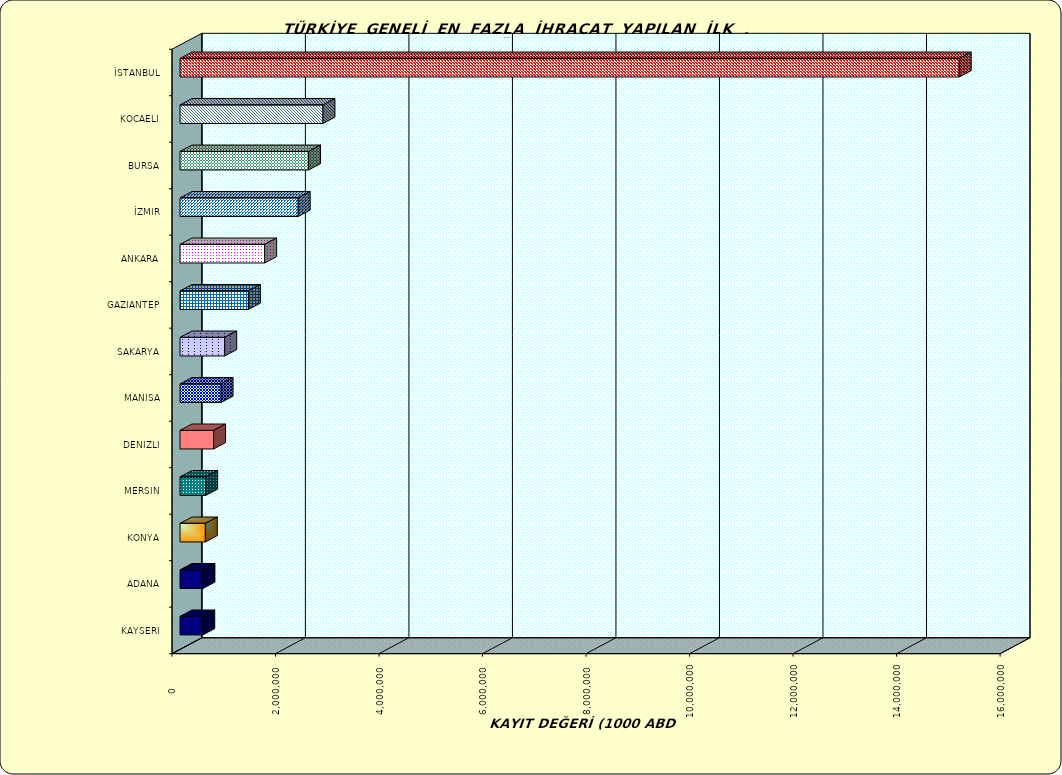
| Category | Series 0 |
|---|---|
| İSTANBUL | 15055789.734 |
| KOCAELI | 2761955.619 |
| BURSA | 2483792.391 |
| İZMIR | 2283121.154 |
| ANKARA | 1635285.584 |
| GAZIANTEP | 1321980.96 |
| SAKARYA | 864166.85 |
| MANISA | 794146.074 |
| DENIZLI | 648662.647 |
| MERSIN | 495301.877 |
| KONYA | 489600.384 |
| ADANA | 442626.437 |
| KAYSERI | 439315.342 |